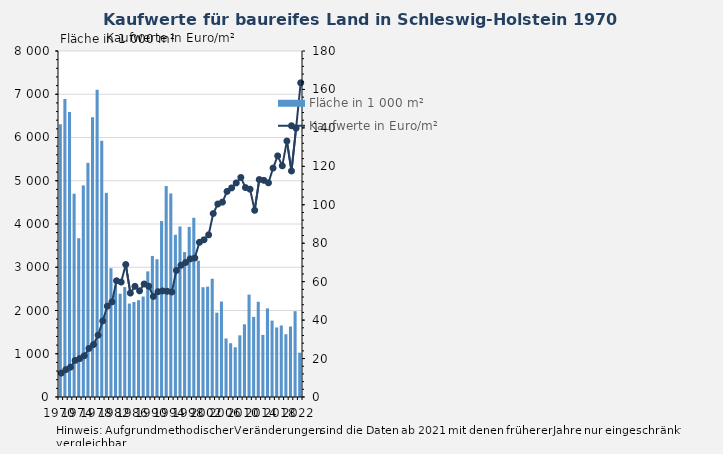
| Category | Fläche in 1 000 m² |
|---|---|
| 1970.0 | 6309.2 |
| 1971.0 | 6893 |
| 1972.0 | 6590.2 |
| 1973.0 | 4700.7 |
| 1974.0 | 3669.7 |
| 1975.0 | 4891.8 |
| 1976.0 | 5414.2 |
| 1977.0 | 6470.1 |
| 1978.0 | 7103.7 |
| 1979.0 | 5922.7 |
| 1980.0 | 4720.9 |
| 1981.0 | 2976.6 |
| 1982.0 | 2585.4 |
| 1983.0 | 2388.2 |
| 1984.0 | 2540.7 |
| 1985.0 | 2160.4 |
| 1986.0 | 2196.1 |
| 1987.0 | 2238.6 |
| 1988.0 | 2323.8 |
| 1989.0 | 2904.5 |
| 1990.0 | 3261.7 |
| 1991.0 | 3185.5 |
| 1992.0 | 4067 |
| 1993.0 | 4877.9 |
| 1994.0 | 4705.8 |
| 1995.0 | 3750.7 |
| 1996.0 | 3941.1 |
| 1997.0 | 3350.9 |
| 1998.0 | 3933 |
| 1999.0 | 4143.4 |
| 2000.0 | 3152.1 |
| 2001.0 | 2538.5 |
| 2002.0 | 2552 |
| 2003.0 | 2734.8 |
| 2004.0 | 1949.3 |
| 2005.0 | 2207.4 |
| 2006.0 | 1352.3 |
| 2007.0 | 1243.8 |
| 2008.0 | 1149.5 |
| 2009.0 | 1426 |
| 2010.0 | 1681 |
| 2011.0 | 2368 |
| 2012.0 | 1852 |
| 2013.0 | 2202 |
| 2014.0 | 1436 |
| 2015.0 | 2049 |
| 2016.0 | 1766 |
| 2017.0 | 1608 |
| 2018.0 | 1653 |
| 2019.0 | 1451 |
| 2020.0 | 1630 |
| 2021.0 | 1984 |
| 2022.0 | 1025 |